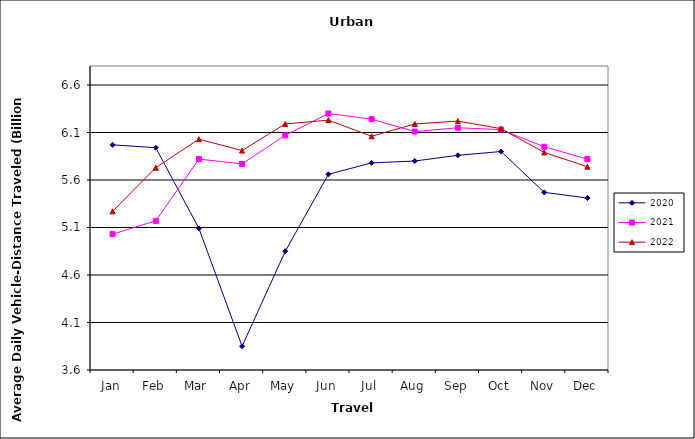
| Category | 2020 | 2021 | 2022 |
|---|---|---|---|
| Jan | 5.97 | 5.03 | 5.27 |
| Feb | 5.94 | 5.17 | 5.73 |
| Mar | 5.09 | 5.82 | 6.03 |
| Apr | 3.85 | 5.77 | 5.91 |
| May | 4.85 | 6.07 | 6.19 |
| Jun | 5.66 | 6.3 | 6.23 |
| Jul | 5.78 | 6.24 | 6.06 |
| Aug | 5.8 | 6.11 | 6.19 |
| Sep | 5.86 | 6.15 | 6.22 |
| Oct | 5.9 | 6.13 | 6.14 |
| Nov | 5.47 | 5.95 | 5.89 |
| Dec | 5.41 | 5.82 | 5.74 |